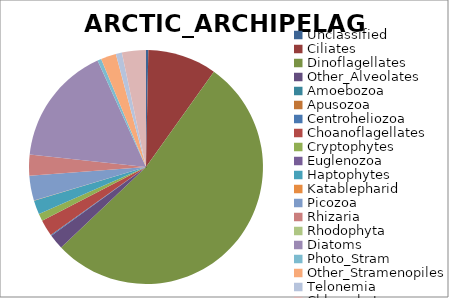
| Category | ARCTIC_ARCHIPELAGO |
|---|---|
| Unclassified | 0.003 |
| Ciliates | 0.095 |
| Dinoflagellates | 0.531 |
| Other_Alveolates | 0.021 |
| Amoebozoa | 0 |
| Apusozoa | 0 |
| Centroheliozoa | 0.001 |
| Choanoflagellates | 0.023 |
| Cryptophytes | 0.01 |
| Euglenozoa | 0 |
| Haptophytes | 0.019 |
| Katablepharid | 0 |
| Picozoa | 0.034 |
| Rhizaria | 0.029 |
| Rhodophyta | 0 |
| Diatoms | 0.165 |
| Photo_Stram | 0.005 |
| Other_Stramenopiles | 0.021 |
| Telonemia | 0.008 |
| Chlorophytes | 0.033 |